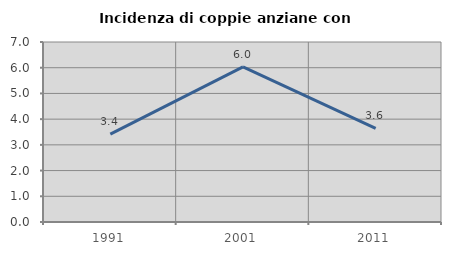
| Category | Incidenza di coppie anziane con figli |
|---|---|
| 1991.0 | 3.416 |
| 2001.0 | 6.033 |
| 2011.0 | 3.643 |